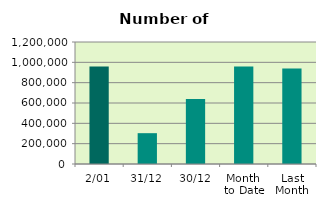
| Category | Series 0 |
|---|---|
| 2/01 | 958394 |
| 31/12 | 303184 |
| 30/12 | 638372 |
| Month 
to Date | 958394 |
| Last
Month | 938735.9 |